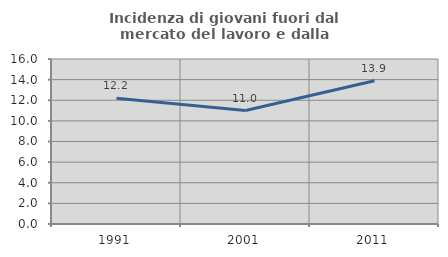
| Category | Incidenza di giovani fuori dal mercato del lavoro e dalla formazione  |
|---|---|
| 1991.0 | 12.195 |
| 2001.0 | 11 |
| 2011.0 | 13.889 |